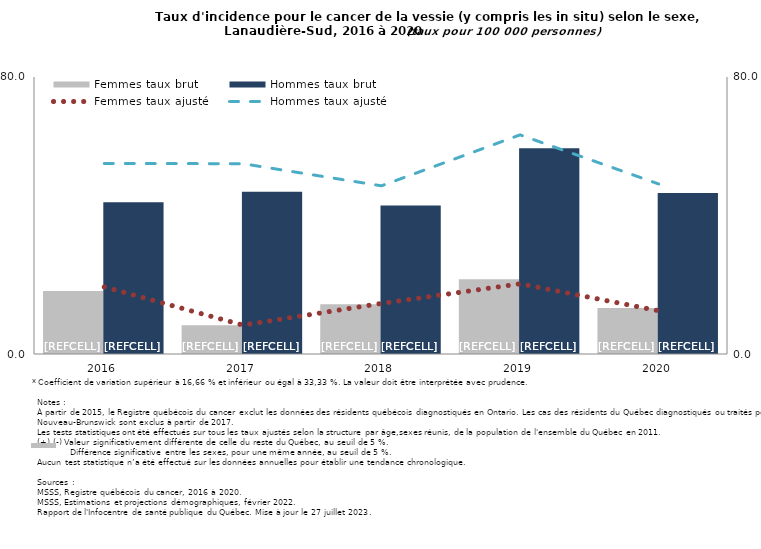
| Category | Femmes taux brut | Hommes taux brut |
|---|---|---|
| 2016.0 | 18.181 | 43.818 |
| 2017.0 | 8.291 | 46.873 |
| 2018.0 | 14.367 | 42.871 |
| 2019.0 | 21.584 | 59.401 |
| 2020.0 | 13.299 | 46.533 |